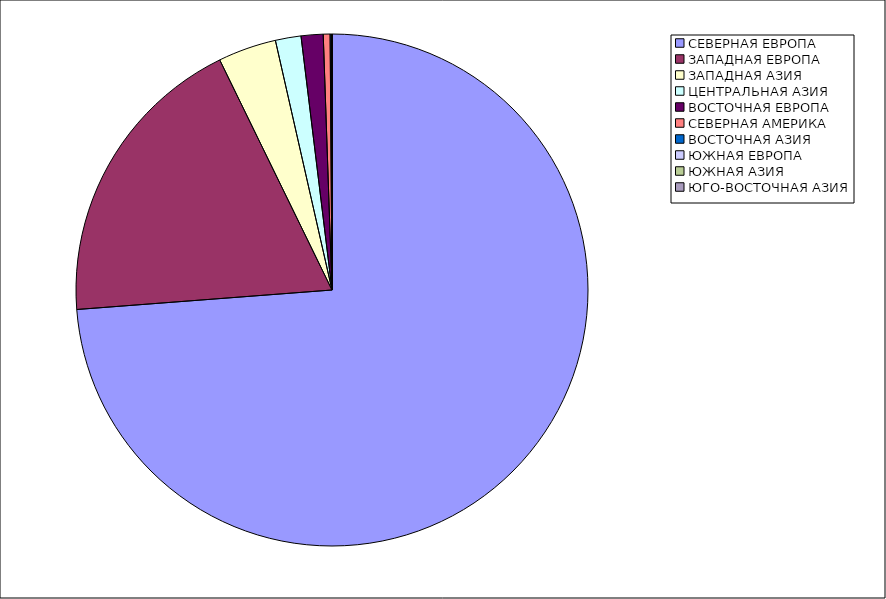
| Category | Оборот |
|---|---|
| СЕВЕРНАЯ ЕВРОПА | 73.785 |
| ЗАПАДНАЯ ЕВРОПА | 18.989 |
| ЗАПАДНАЯ АЗИЯ | 3.675 |
| ЦЕНТРАЛЬНАЯ АЗИЯ | 1.617 |
| ВОСТОЧНАЯ ЕВРОПА | 1.386 |
| СЕВЕРНАЯ АМЕРИКА | 0.43 |
| ВОСТОЧНАЯ АЗИЯ | 0.108 |
| ЮЖНАЯ ЕВРОПА | 0.007 |
| ЮЖНАЯ АЗИЯ | 0.002 |
| ЮГО-ВОСТОЧНАЯ АЗИЯ | 0 |